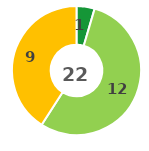
| Category | Series 0 |
|---|---|
| 0 | 1 |
| 1 | 12 |
| 2 | 9 |
| 3 | 0 |
| 4 | 0 |